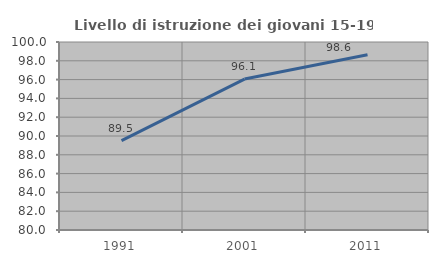
| Category | Livello di istruzione dei giovani 15-19 anni |
|---|---|
| 1991.0 | 89.513 |
| 2001.0 | 96.054 |
| 2011.0 | 98.64 |